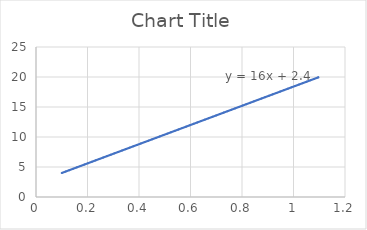
| Category | Series 0 |
|---|---|
| 0.1 | 4 |
| 1.1 | 20 |